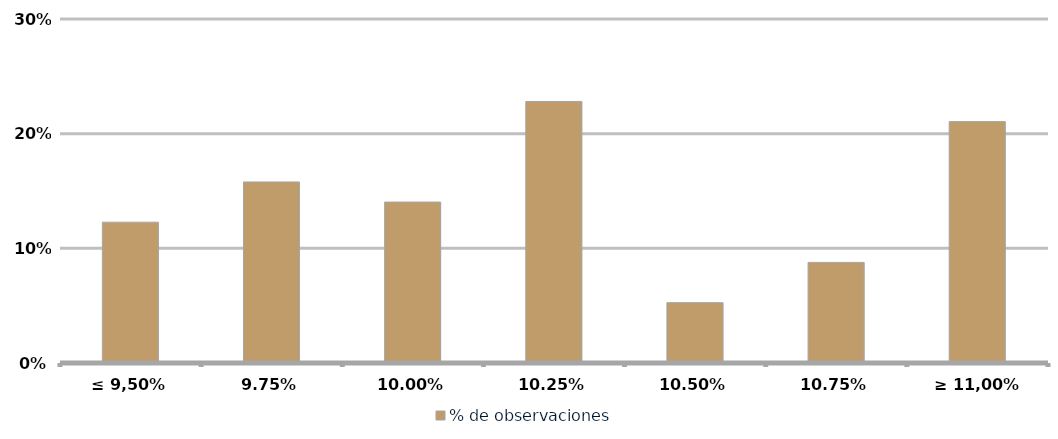
| Category | % de observaciones  |
|---|---|
| ≤ 9,50% | 0.123 |
| 9,75% | 0.158 |
| 10,00% | 0.14 |
| 10,25% | 0.228 |
| 10,50% | 0.053 |
| 10,75% | 0.088 |
| ≥ 11,00% | 0.211 |